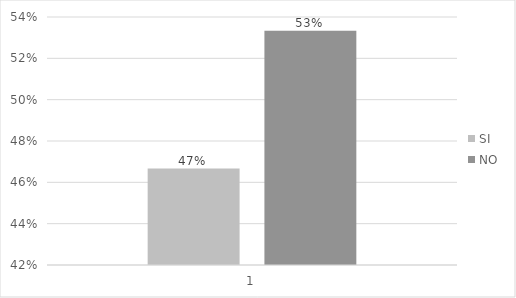
| Category | SI | NO |
|---|---|---|
| 0 | 0.467 | 0.533 |